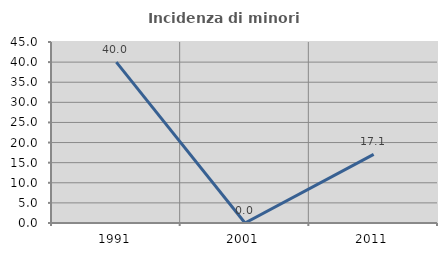
| Category | Incidenza di minori stranieri |
|---|---|
| 1991.0 | 40 |
| 2001.0 | 0 |
| 2011.0 | 17.073 |